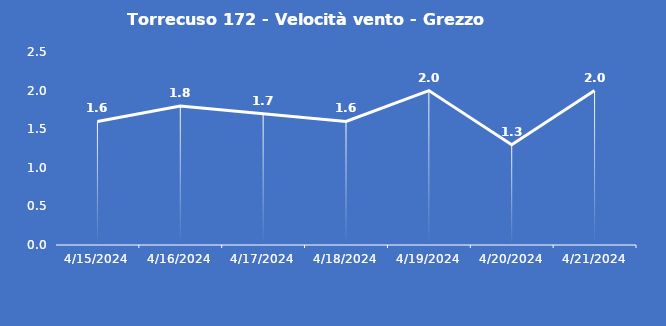
| Category | Torrecuso 172 - Velocità vento - Grezzo (m/s) |
|---|---|
| 4/15/24 | 1.6 |
| 4/16/24 | 1.8 |
| 4/17/24 | 1.7 |
| 4/18/24 | 1.6 |
| 4/19/24 | 2 |
| 4/20/24 | 1.3 |
| 4/21/24 | 2 |